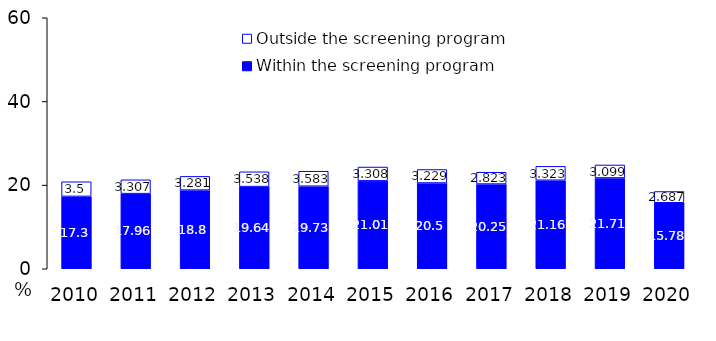
| Category | Within the screening program | Outside the screening program |
|---|---|---|
| 2010.0 | 17.3 | 3.5 |
| 2011.0 | 17.96 | 3.307 |
| 2012.0 | 18.8 | 3.281 |
| 2013.0 | 19.64 | 3.538 |
| 2014.0 | 19.73 | 3.583 |
| 2015.0 | 21.01 | 3.308 |
| 2016.0 | 20.5 | 3.229 |
| 2017.0 | 20.25 | 2.823 |
| 2018.0 | 21.16 | 3.323 |
| 2019.0 | 21.71 | 3.099 |
| 2020.0 | 15.78 | 2.687 |